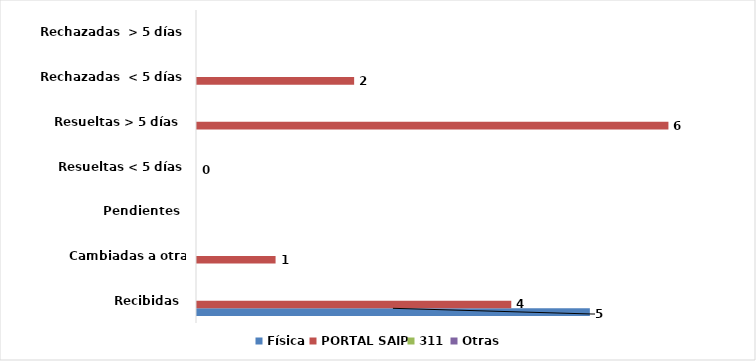
| Category | Física | PORTAL SAIP | 311 | Otras |
|---|---|---|---|---|
| Recibidas  | 5 | 4 | 0 | 0 |
| Cambiadas a otra institución | 0 | 1 | 0 | 0 |
| Pendientes  | 0 | 0 | 0 | 0 |
| Resueltas < 5 días | 0 | 0 | 0 | 0 |
| Resueltas > 5 días  | 0 | 6 | 0 | 0 |
| Rechazadas  < 5 días | 0 | 2 | 0 | 0 |
| Rechazadas  > 5 días | 0 | 0 | 0 | 0 |